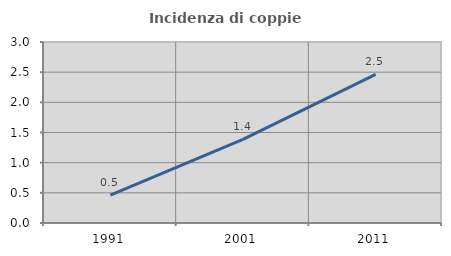
| Category | Incidenza di coppie miste |
|---|---|
| 1991.0 | 0.461 |
| 2001.0 | 1.386 |
| 2011.0 | 2.465 |